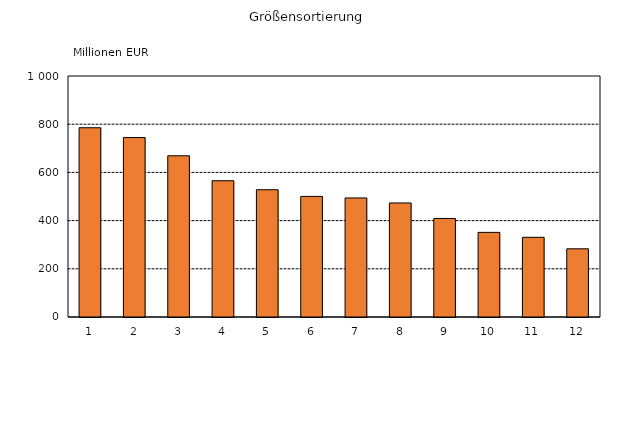
| Category | Series 0 |
|---|---|
| 1 | 785.318 |
| 2 | 744.616 |
| 3 | 668.921 |
| 4 | 565.357 |
| 5 | 528.131 |
| 6 | 500.336 |
| 7 | 493.982 |
| 8 | 473.132 |
| 9 | 408.81 |
| 10 | 351.19 |
| 11 | 330.608 |
| 12 | 282.882 |